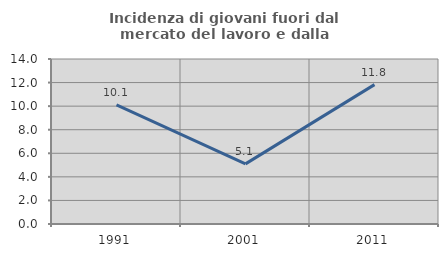
| Category | Incidenza di giovani fuori dal mercato del lavoro e dalla formazione  |
|---|---|
| 1991.0 | 10.112 |
| 2001.0 | 5.102 |
| 2011.0 | 11.828 |